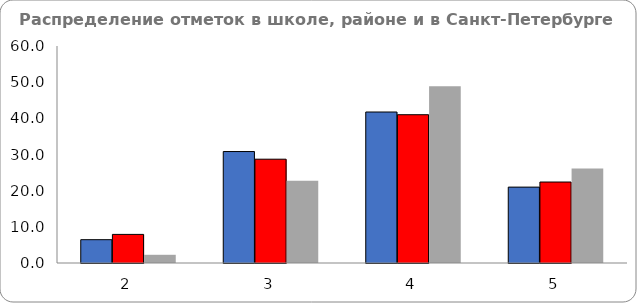
| Category | Series 0 | Series 1 | Series 2 |
|---|---|---|---|
| 2.0 | 6.45 | 7.91 | 2.27 |
| 3.0 | 30.82 | 28.7 | 22.73 |
| 4.0 | 41.75 | 41 | 48.86 |
| 5.0 | 20.98 | 22.39 | 26.14 |